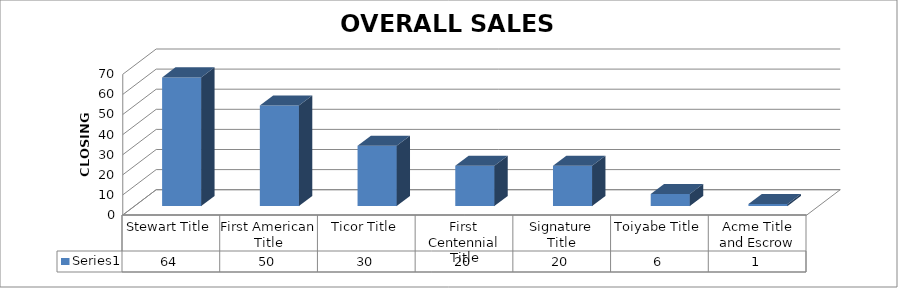
| Category | Series 0 |
|---|---|
| Stewart Title | 64 |
| First American Title | 50 |
| Ticor Title | 30 |
| First Centennial Title | 20 |
| Signature Title | 20 |
| Toiyabe Title | 6 |
| Acme Title and Escrow | 1 |